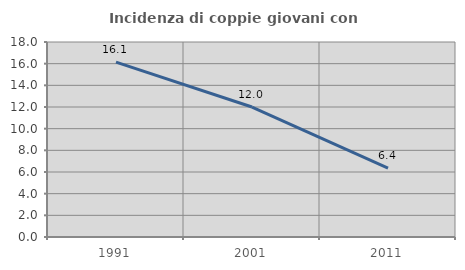
| Category | Incidenza di coppie giovani con figli |
|---|---|
| 1991.0 | 16.138 |
| 2001.0 | 11.996 |
| 2011.0 | 6.357 |